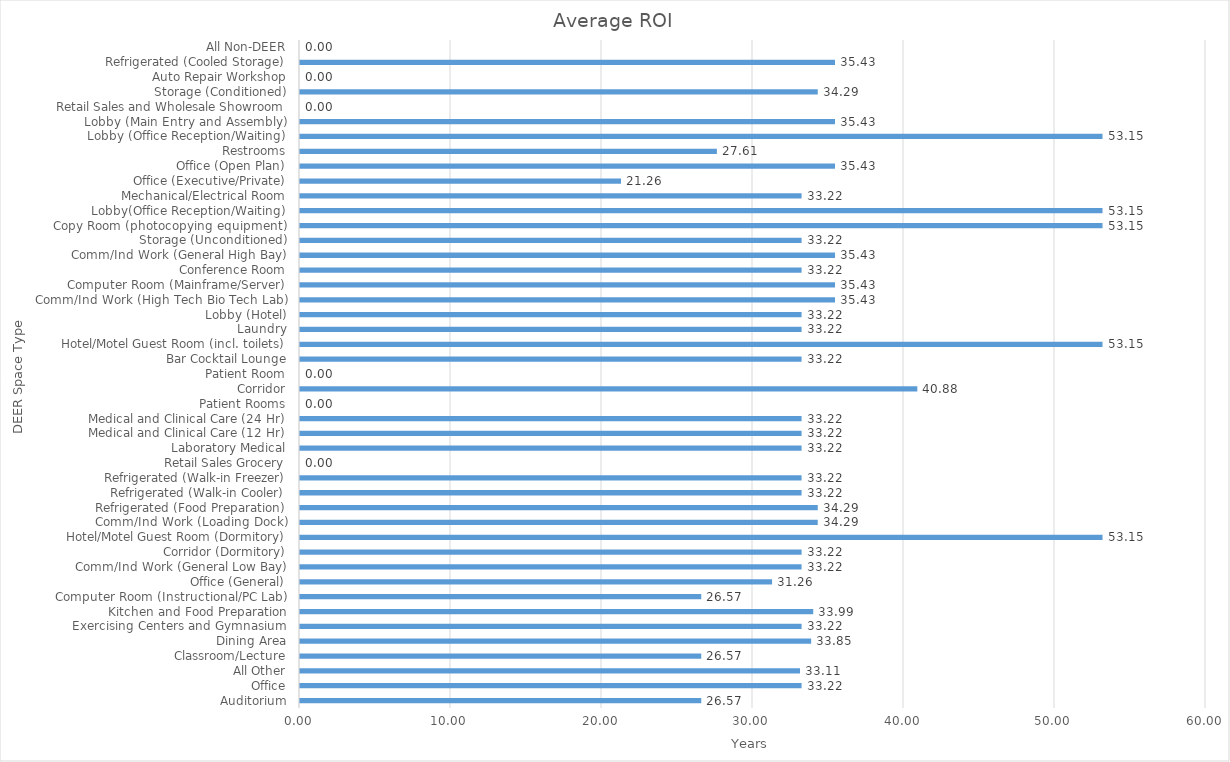
| Category | Average ROI |
|---|---|
| Auditorium | 26.573 |
| Office | 33.217 |
| All Other | 33.113 |
| Classroom/Lecture | 26.573 |
| Dining Area | 33.851 |
| Exercising Centers and Gymnasium | 33.217 |
| Kitchen and Food Preparation | 33.989 |
| Computer Room (Instructional/PC Lab) | 26.573 |
| Office (General) | 31.263 |
| Comm/Ind Work (General Low Bay) | 33.217 |
| Corridor (Dormitory) | 33.217 |
| Hotel/Motel Guest Room (Dormitory) | 53.147 |
| Comm/Ind Work (Loading Dock) | 34.288 |
| Refrigerated (Food Preparation) | 34.288 |
| Refrigerated (Walk-in Cooler) | 33.217 |
| Refrigerated (Walk-in Freezer) | 33.217 |
| Retail Sales Grocery | 0 |
| Laboratory Medical | 33.217 |
| Medical and Clinical Care (12 Hr) | 33.217 |
| Medical and Clinical Care (24 Hr) | 33.217 |
| Patient Rooms | 0 |
| Corridor | 40.882 |
| Patient Room | 0 |
| Bar Cocktail Lounge | 33.217 |
| Hotel/Motel Guest Room (incl. toilets) | 53.147 |
| Laundry | 33.217 |
| Lobby (Hotel) | 33.217 |
| Comm/Ind Work (High Tech Bio Tech Lab) | 35.431 |
| Computer Room (Mainframe/Server) | 35.431 |
| Conference Room | 33.217 |
| Comm/Ind Work (General High Bay) | 35.431 |
| Storage (Unconditioned) | 33.217 |
| Copy Room (photocopying equipment) | 53.147 |
| Lobby(Office Reception/Waiting) | 53.147 |
| Mechanical/Electrical Room | 33.217 |
| Office (Executive/Private) | 21.259 |
| Office (Open Plan) | 35.431 |
| Restrooms | 27.609 |
| Lobby (Office Reception/Waiting) | 53.147 |
| Lobby (Main Entry and Assembly) | 35.431 |
| Retail Sales and Wholesale Showroom | 0 |
| Storage (Conditioned) | 34.288 |
| Auto Repair Workshop | 0 |
| Refrigerated (Cooled Storage) | 35.431 |
| All Non-DEER | 0 |